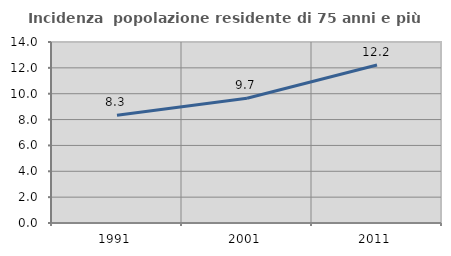
| Category | Incidenza  popolazione residente di 75 anni e più |
|---|---|
| 1991.0 | 8.33 |
| 2001.0 | 9.653 |
| 2011.0 | 12.219 |